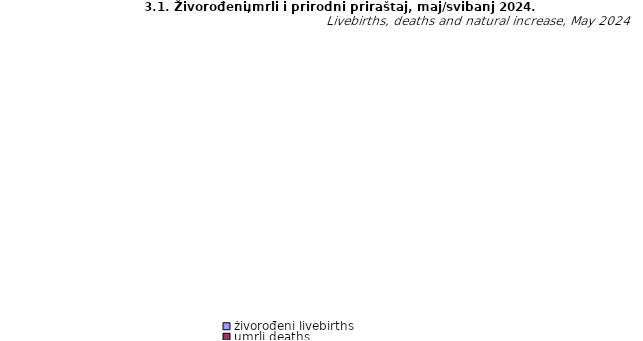
| Category | živorođeni livebirths | umrli deaths | prirodni priraštaj natural increase |
|---|---|---|---|
| Unsko - sanski | 99 | 156 | -57 |
| Kanton Posavski | 12 | 36 | -24 |
| Tuzlanski | 262 | 364 | -102 |
| Zeničko - dobojski | 230 | 314 | -84 |
| Bosansko - podrinjski | 13 | 17 | -4 |
| Srednjobosanski | 136 | 197 | -61 |
| Hercegovačko-neretvanski | 108 | 147 | -39 |
| Zapadnohercegovački | 78 | 50 | 28 |
| Kanton Sarajevo | 289 | 363 | -74 |
| Kanton 10 | 17 | 48 | -31 |